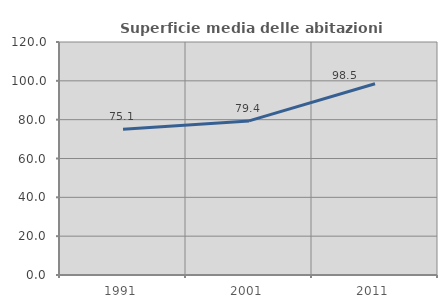
| Category | Superficie media delle abitazioni occupate |
|---|---|
| 1991.0 | 75.089 |
| 2001.0 | 79.376 |
| 2011.0 | 98.494 |